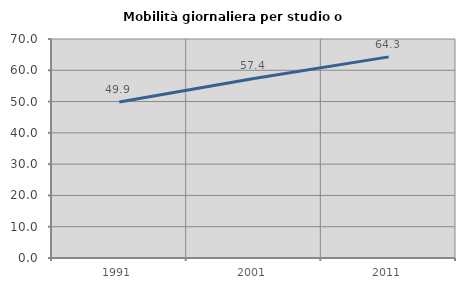
| Category | Mobilità giornaliera per studio o lavoro |
|---|---|
| 1991.0 | 49.867 |
| 2001.0 | 57.385 |
| 2011.0 | 64.286 |